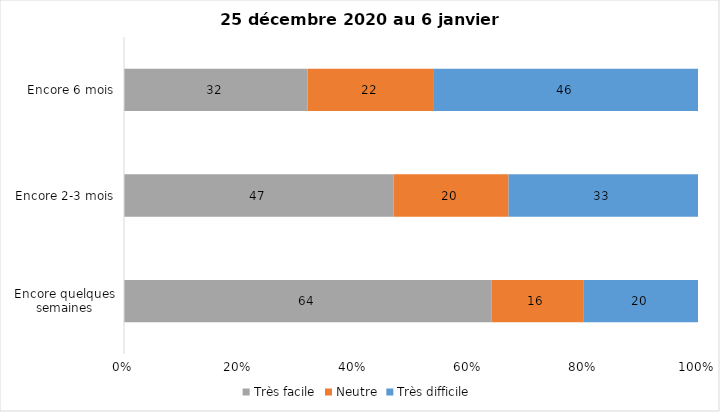
| Category | Très facile | Neutre | Très difficile |
|---|---|---|---|
| Encore quelques semaines | 64 | 16 | 20 |
| Encore 2-3 mois | 47 | 20 | 33 |
| Encore 6 mois | 32 | 22 | 46 |